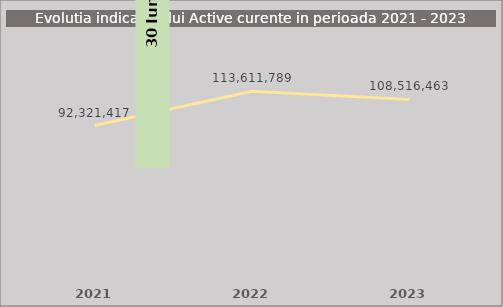
| Category | Series 0 |
|---|---|
| 2021.0 | 92321417 |
| 2022.0 | 113611789 |
| 2023.0 | 108516463 |